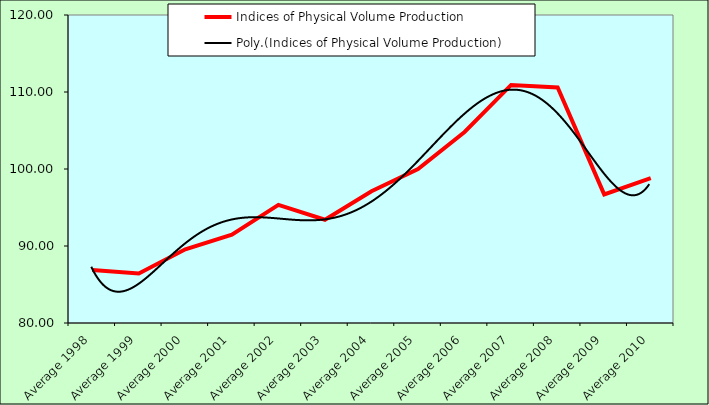
| Category | Indices of Physical Volume Production |
|---|---|
| Average 1998 | 86.875 |
| Average 1999 | 86.433 |
| Average 2000 | 89.567 |
| Average 2001 | 91.467 |
| Average 2002 | 95.342 |
| Average 2003 | 93.408 |
| Average 2004 | 97.117 |
| Average 2005 | 99.983 |
| Average 2006 | 104.808 |
| Average 2007 | 110.918 |
| Average 2008 | 110.583 |
| Average 2009 | 96.7 |
| Average 2010 | 98.829 |